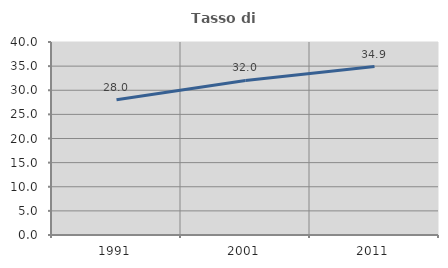
| Category | Tasso di occupazione   |
|---|---|
| 1991.0 | 28.044 |
| 2001.0 | 32.029 |
| 2011.0 | 34.904 |